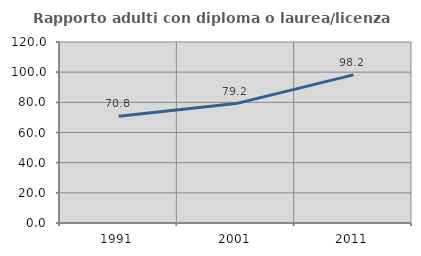
| Category | Rapporto adulti con diploma o laurea/licenza media  |
|---|---|
| 1991.0 | 70.833 |
| 2001.0 | 79.167 |
| 2011.0 | 98.182 |